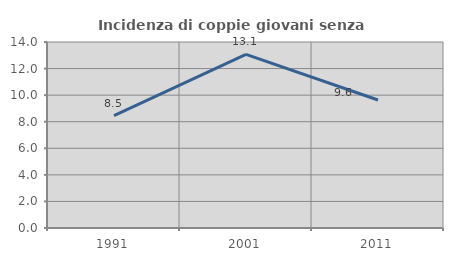
| Category | Incidenza di coppie giovani senza figli |
|---|---|
| 1991.0 | 8.462 |
| 2001.0 | 13.07 |
| 2011.0 | 9.636 |